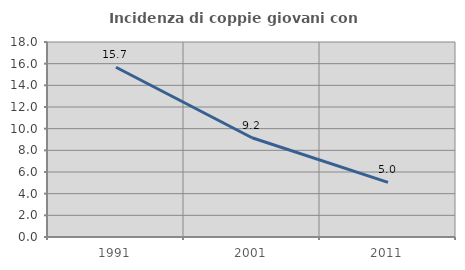
| Category | Incidenza di coppie giovani con figli |
|---|---|
| 1991.0 | 15.666 |
| 2001.0 | 9.158 |
| 2011.0 | 5.044 |